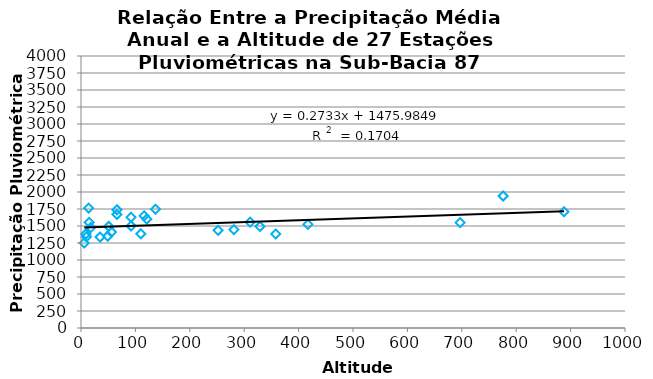
| Category | Series 0 |
|---|---|
| 121.0 | 1601.723 |
| 49.0 | 1349.98 |
| 417.0 | 1523.861 |
| 252.0 | 1437.28 |
| 329.0 | 1493.83 |
| 51.0 | 1494.311 |
| 10.0 | 1341.24 |
| 116.0 | 1649.357 |
| 281.0 | 1447.77 |
| 311.0 | 1556.73 |
| 9.0 | 1382.119 |
| 15.0 | 1552.843 |
| 92.0 | 1628.803 |
| 358.0 | 1383.15 |
| 697.0 | 1549.477 |
| 888.0 | 1709.447 |
| 56.0 | 1410.002 |
| 110.0 | 1385.5 |
| 66.0 | 1669.924 |
| 14.0 | 1762.475 |
| 66.0 | 1738.547 |
| 18.0 | 1477.303 |
| 137.0 | 1746.003 |
| 92.0 | 1501.307 |
| 6.0 | 1248.973 |
| 35.0 | 1336.589 |
| 776.0 | 1941.263 |